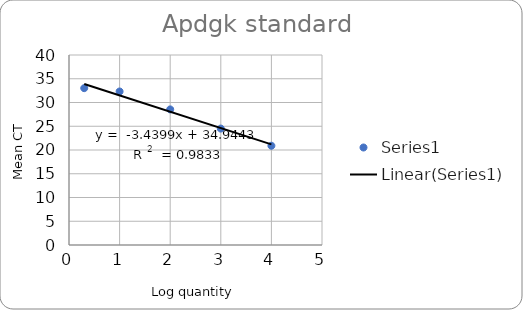
| Category | Series 0 |
|---|---|
| 4.0 | 20.894 |
| 3.0 | 24.511 |
| 2.0 | 28.545 |
| 1.0 | 32.318 |
| 0.3010299956639812 | 33.02 |